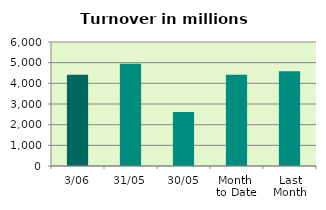
| Category | Series 0 |
|---|---|
| 3/06 | 4420.474 |
| 31/05 | 4943.61 |
| 30/05 | 2614.987 |
| Month 
to Date | 4420.474 |
| Last
Month | 4586.899 |